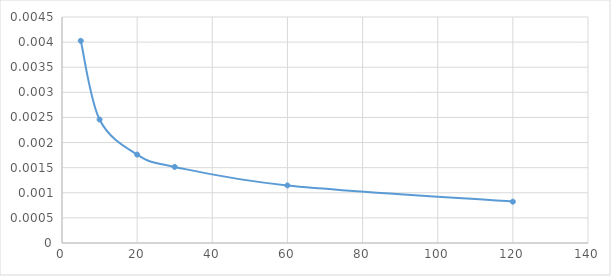
| Category | Series 0 |
|---|---|
| 5.0 | 0.004 |
| 10.0 | 0.002 |
| 20.0 | 0.002 |
| 30.0 | 0.002 |
| 60.0 | 0.001 |
| 120.0 | 0.001 |